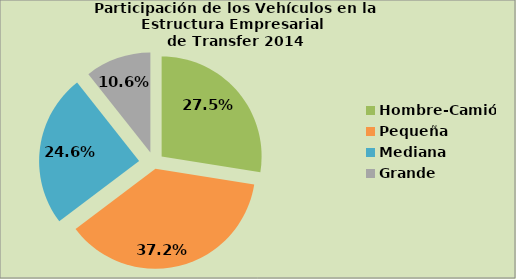
| Category | Series 0 |
|---|---|
| Hombre-Camión | 27.52 |
| Pequeña | 37.203 |
| Mediana | 24.633 |
| Grande | 10.644 |